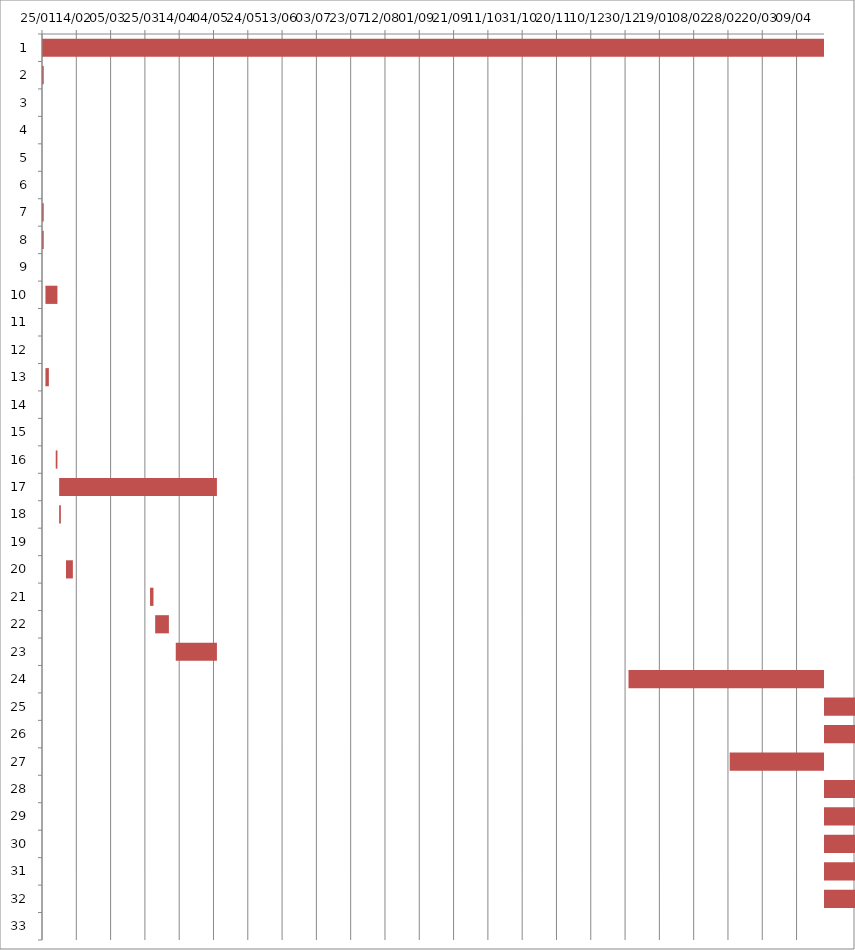
| Category | Fecha de inicio | DURACIÓN |
|---|---|---|
| 0 | 1/25/16 | 644 |
| 1 | 1/25/16 | 1 |
| 2 | 1/25/16 | 0 |
| 3 | 1/25/16 | 0 |
| 4 | 1/25/16 | 0 |
| 5 | 1/25/16 | 0 |
| 6 | 1/25/16 | 1 |
| 7 | 1/25/16 | 1 |
| 8 | 1/26/16 | 0 |
| 9 | 1/27/16 | 7 |
| 10 | 1/27/16 | 0 |
| 11 | 1/28/16 | 0 |
| 12 | 1/27/16 | 2 |
| 13 | 2/1/16 | 0 |
| 14 | 2/2/16 | 0 |
| 15 | 2/2/16 | 1 |
| 16 | 2/4/16 | 92 |
| 17 | 2/4/16 | 1 |
| 18 | 2/5/16 | 0 |
| 19 | 2/8/16 | 4 |
| 20 | 3/28/16 | 2 |
| 21 | 3/31/16 | 8 |
| 22 | 4/12/16 | 24 |
| 23 | 1/1/17 | 302 |
| 24 | 8/1/17 | 90 |
| 25 | 8/1/17 | 90 |
| 26 | 3/1/17 | 150 |
| 27 | 10/23/17 | 4 |
| 28 | 10/23/17 | 4 |
| 29 | 10/16/17 | 4 |
| 30 | 10/2/17 | 25 |
| 31 | 10/2/17 | 25 |
| 32 | 10/30/17 | 0 |